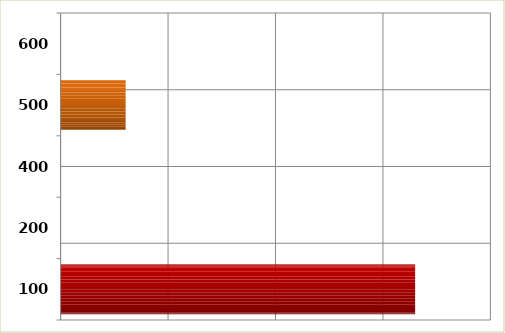
| Category | Series 0 |
|---|---|
| 100.0 | 329953988 |
| 200.0 | 0 |
| 400.0 | 0 |
| 500.0 | 60524181 |
| 600.0 | 0 |